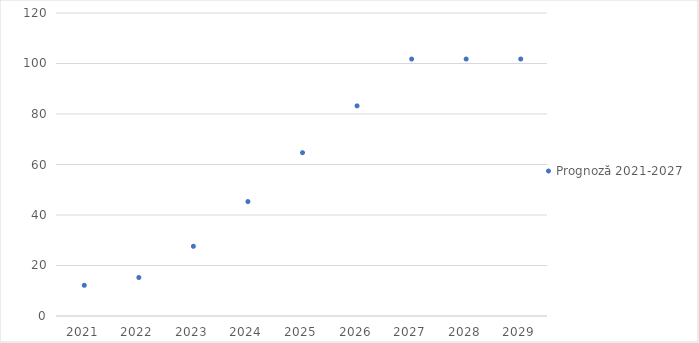
| Category | Prognoză 2021-2027 |
|---|---|
| 2021.0 | 12.155 |
| 2022.0 | 15.245 |
| 2023.0 | 27.605 |
| 2024.0 | 45.322 |
| 2025.0 | 64.687 |
| 2026.0 | 83.228 |
| 2027.0 | 101.768 |
| 2028.0 | 101.768 |
| 2029.0 | 101.768 |